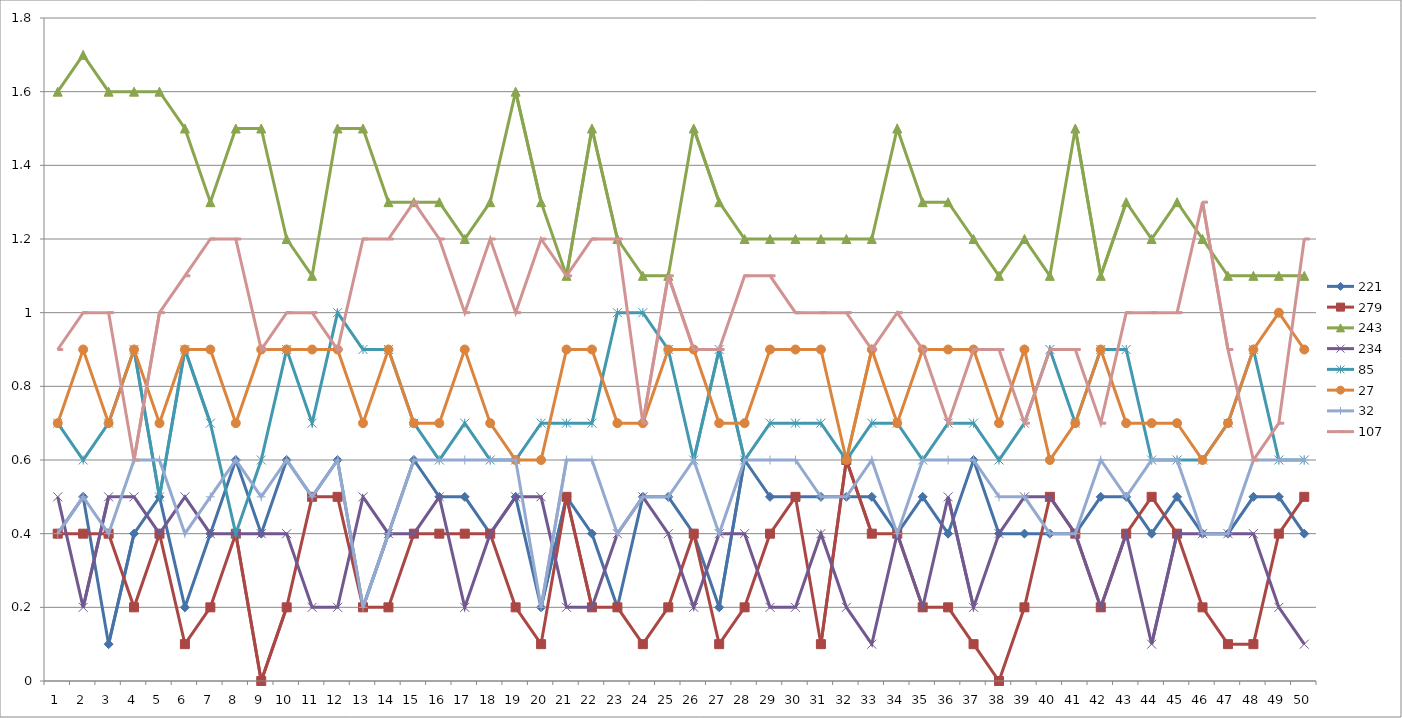
| Category | 221 | 279 | 243 | 234 | 85 | 27 | 32 | 107 |
|---|---|---|---|---|---|---|---|---|
| 0 | 0.4 | 0.4 | 1.6 | 0.5 | 0.7 | 0.7 | 0.4 | 0.9 |
| 1 | 0.5 | 0.4 | 1.7 | 0.2 | 0.6 | 0.9 | 0.5 | 1 |
| 2 | 0.1 | 0.4 | 1.6 | 0.5 | 0.7 | 0.7 | 0.4 | 1 |
| 3 | 0.4 | 0.2 | 1.6 | 0.5 | 0.9 | 0.9 | 0.6 | 0.6 |
| 4 | 0.5 | 0.4 | 1.6 | 0.4 | 0.5 | 0.7 | 0.6 | 1 |
| 5 | 0.2 | 0.1 | 1.5 | 0.5 | 0.9 | 0.9 | 0.4 | 1.1 |
| 6 | 0.4 | 0.2 | 1.3 | 0.4 | 0.7 | 0.9 | 0.5 | 1.2 |
| 7 | 0.6 | 0.4 | 1.5 | 0.4 | 0.4 | 0.7 | 0.6 | 1.2 |
| 8 | 0.4 | 0 | 1.5 | 0.4 | 0.6 | 0.9 | 0.5 | 0.9 |
| 9 | 0.6 | 0.2 | 1.2 | 0.4 | 0.9 | 0.9 | 0.6 | 1 |
| 10 | 0.5 | 0.5 | 1.1 | 0.2 | 0.7 | 0.9 | 0.5 | 1 |
| 11 | 0.6 | 0.5 | 1.5 | 0.2 | 1 | 0.9 | 0.6 | 0.9 |
| 12 | 0.2 | 0.2 | 1.5 | 0.5 | 0.9 | 0.7 | 0.2 | 1.2 |
| 13 | 0.4 | 0.2 | 1.3 | 0.4 | 0.9 | 0.9 | 0.4 | 1.2 |
| 14 | 0.6 | 0.4 | 1.3 | 0.4 | 0.7 | 0.7 | 0.6 | 1.3 |
| 15 | 0.5 | 0.4 | 1.3 | 0.5 | 0.6 | 0.7 | 0.6 | 1.2 |
| 16 | 0.5 | 0.4 | 1.2 | 0.2 | 0.7 | 0.9 | 0.6 | 1 |
| 17 | 0.4 | 0.4 | 1.3 | 0.4 | 0.6 | 0.7 | 0.6 | 1.2 |
| 18 | 0.5 | 0.2 | 1.6 | 0.5 | 0.6 | 0.6 | 0.6 | 1 |
| 19 | 0.2 | 0.1 | 1.3 | 0.5 | 0.7 | 0.6 | 0.2 | 1.2 |
| 20 | 0.5 | 0.5 | 1.1 | 0.2 | 0.7 | 0.9 | 0.6 | 1.1 |
| 21 | 0.4 | 0.2 | 1.5 | 0.2 | 0.7 | 0.9 | 0.6 | 1.2 |
| 22 | 0.2 | 0.2 | 1.2 | 0.4 | 1 | 0.7 | 0.4 | 1.2 |
| 23 | 0.5 | 0.1 | 1.1 | 0.5 | 1 | 0.7 | 0.5 | 0.7 |
| 24 | 0.5 | 0.2 | 1.1 | 0.4 | 0.9 | 0.9 | 0.5 | 1.1 |
| 25 | 0.4 | 0.4 | 1.5 | 0.2 | 0.6 | 0.9 | 0.6 | 0.9 |
| 26 | 0.2 | 0.1 | 1.3 | 0.4 | 0.9 | 0.7 | 0.4 | 0.9 |
| 27 | 0.6 | 0.2 | 1.2 | 0.4 | 0.6 | 0.7 | 0.6 | 1.1 |
| 28 | 0.5 | 0.4 | 1.2 | 0.2 | 0.7 | 0.9 | 0.6 | 1.1 |
| 29 | 0.5 | 0.5 | 1.2 | 0.2 | 0.7 | 0.9 | 0.6 | 1 |
| 30 | 0.5 | 0.1 | 1.2 | 0.4 | 0.7 | 0.9 | 0.5 | 1 |
| 31 | 0.5 | 0.6 | 1.2 | 0.2 | 0.6 | 0.6 | 0.5 | 1 |
| 32 | 0.5 | 0.4 | 1.2 | 0.1 | 0.7 | 0.9 | 0.6 | 0.9 |
| 33 | 0.4 | 0.4 | 1.5 | 0.4 | 0.7 | 0.7 | 0.4 | 1 |
| 34 | 0.5 | 0.2 | 1.3 | 0.2 | 0.6 | 0.9 | 0.6 | 0.9 |
| 35 | 0.4 | 0.2 | 1.3 | 0.5 | 0.7 | 0.9 | 0.6 | 0.7 |
| 36 | 0.6 | 0.1 | 1.2 | 0.2 | 0.7 | 0.9 | 0.6 | 0.9 |
| 37 | 0.4 | 0 | 1.1 | 0.4 | 0.6 | 0.7 | 0.5 | 0.9 |
| 38 | 0.4 | 0.2 | 1.2 | 0.5 | 0.7 | 0.9 | 0.5 | 0.7 |
| 39 | 0.4 | 0.5 | 1.1 | 0.5 | 0.9 | 0.6 | 0.4 | 0.9 |
| 40 | 0.4 | 0.4 | 1.5 | 0.4 | 0.7 | 0.7 | 0.4 | 0.9 |
| 41 | 0.5 | 0.2 | 1.1 | 0.2 | 0.9 | 0.9 | 0.6 | 0.7 |
| 42 | 0.5 | 0.4 | 1.3 | 0.4 | 0.9 | 0.7 | 0.5 | 1 |
| 43 | 0.4 | 0.5 | 1.2 | 0.1 | 0.6 | 0.7 | 0.6 | 1 |
| 44 | 0.5 | 0.4 | 1.3 | 0.4 | 0.6 | 0.7 | 0.6 | 1 |
| 45 | 0.4 | 0.2 | 1.2 | 0.4 | 0.6 | 0.6 | 0.4 | 1.3 |
| 46 | 0.4 | 0.1 | 1.1 | 0.4 | 0.7 | 0.7 | 0.4 | 0.9 |
| 47 | 0.5 | 0.1 | 1.1 | 0.4 | 0.9 | 0.9 | 0.6 | 0.6 |
| 48 | 0.5 | 0.4 | 1.1 | 0.2 | 0.6 | 1 | 0.6 | 0.7 |
| 49 | 0.4 | 0.5 | 1.1 | 0.1 | 0.6 | 0.9 | 0.6 | 1.2 |